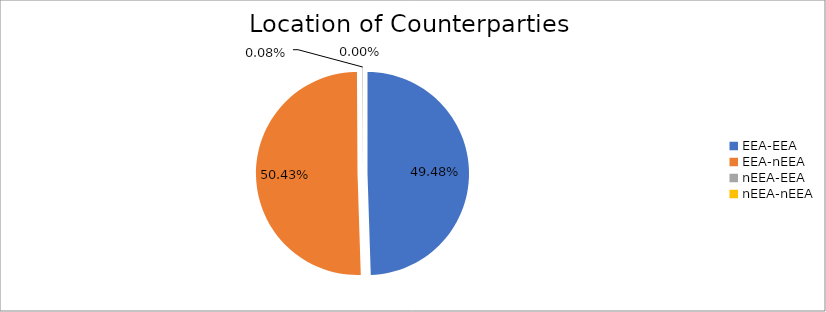
| Category | Series 0 |
|---|---|
| EEA-EEA | 6220061.347 |
| EEA-nEEA | 6338855.553 |
| nEEA-EEA | 10285.902 |
| nEEA-nEEA | 619.226 |